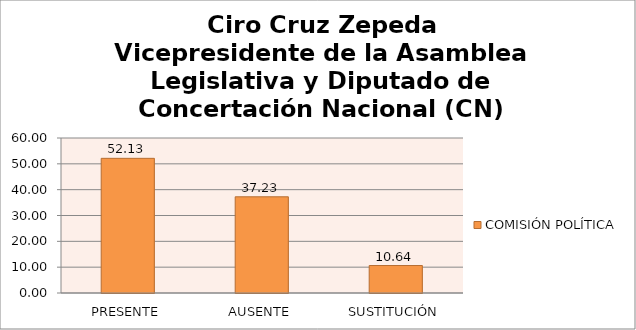
| Category | COMISIÓN POLÍTICA |
|---|---|
| PRESENTE | 52.128 |
| AUSENTE | 37.234 |
| SUSTITUCIÓN | 10.638 |